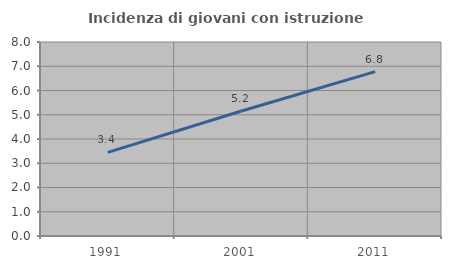
| Category | Incidenza di giovani con istruzione universitaria |
|---|---|
| 1991.0 | 3.448 |
| 2001.0 | 5.155 |
| 2011.0 | 6.78 |